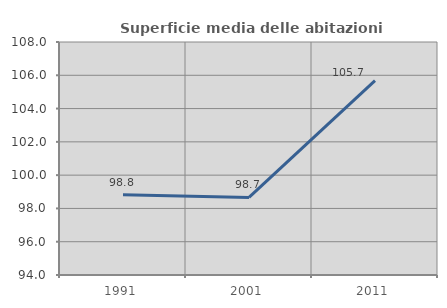
| Category | Superficie media delle abitazioni occupate |
|---|---|
| 1991.0 | 98.815 |
| 2001.0 | 98.662 |
| 2011.0 | 105.681 |